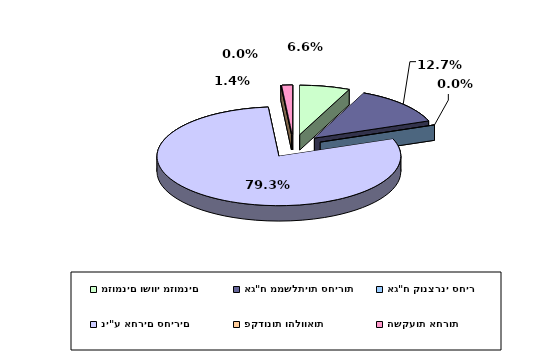
| Category | Series 0 |
|---|---|
| מזומנים ושווי מזומנים | 0.066 |
| אג"ח ממשלתיות סחירות | 0.127 |
| אג"ח קונצרני סחיר | 0 |
| ני"ע אחרים סחירים | 0.793 |
| פקדונות והלוואות | 0 |
| השקעות אחרות | 0.014 |